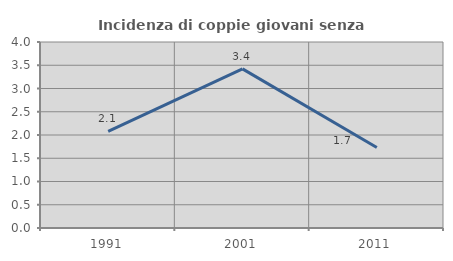
| Category | Incidenza di coppie giovani senza figli |
|---|---|
| 1991.0 | 2.076 |
| 2001.0 | 3.422 |
| 2011.0 | 1.732 |